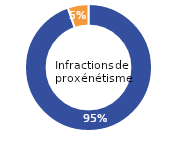
| Category | Infractions de proxénétisme |
|---|---|
| Femme (%) | 94.63 |
| Homme (%) | 5.29 |